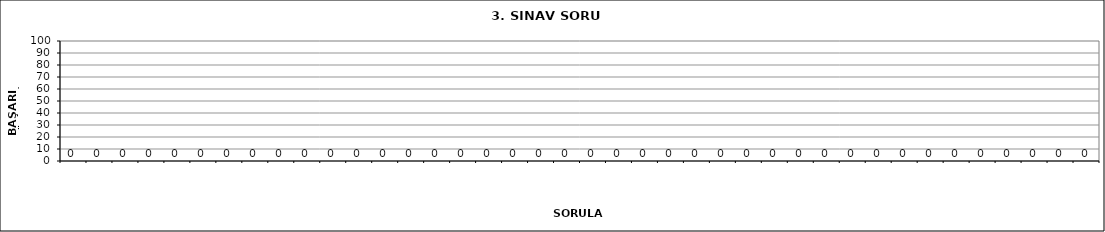
| Category | Series 0 |
|---|---|
|   | 0 |
|   | 0 |
|   | 0 |
|   | 0 |
|   | 0 |
|   | 0 |
|   | 0 |
|   | 0 |
|   | 0 |
|   | 0 |
|   | 0 |
|   | 0 |
|   | 0 |
|   | 0 |
|   | 0 |
|   | 0 |
|   | 0 |
|   | 0 |
|   | 0 |
|   | 0 |
|   | 0 |
|   | 0 |
|   | 0 |
|   | 0 |
|   | 0 |
|   | 0 |
|   | 0 |
|   | 0 |
|   | 0 |
|   | 0 |
|   | 0 |
|   | 0 |
|   | 0 |
|   | 0 |
|   | 0 |
|   | 0 |
|   | 0 |
|   | 0 |
|   | 0 |
|   | 0 |